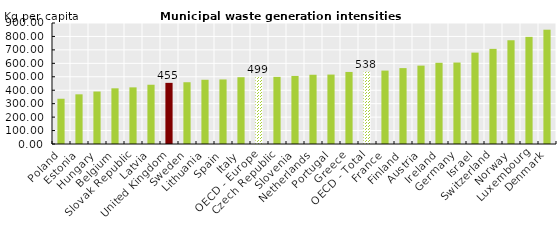
| Category | Series 0 |
|---|---|
| Poland | 336.594 |
| Estonia | 369.457 |
| Hungary | 390.307 |
| Belgium | 414.178 |
| Slovak Republic | 421.267 |
| Latvia | 440.759 |
| United Kingdom | 454.715 |
| Sweden | 459.41 |
| Lithuania | 477.827 |
| Spain | 480.089 |
| Italy | 496.762 |
| OECD - Europe | 499.316 |
| Czech Republic | 499.337 |
| Slovenia | 506.22 |
| Netherlands | 515.058 |
| Portugal | 516.457 |
| Greece | 535.944 |
| OECD - Total | 538.288 |
| France | 546.029 |
| Finland | 564.464 |
| Austria | 582.939 |
| Ireland | 604 |
| Germany | 606.005 |
| Israel | 679.704 |
| Switzerland | 707.571 |
| Norway | 771.687 |
| Luxembourg | 796.947 |
| Denmark | 850.237 |